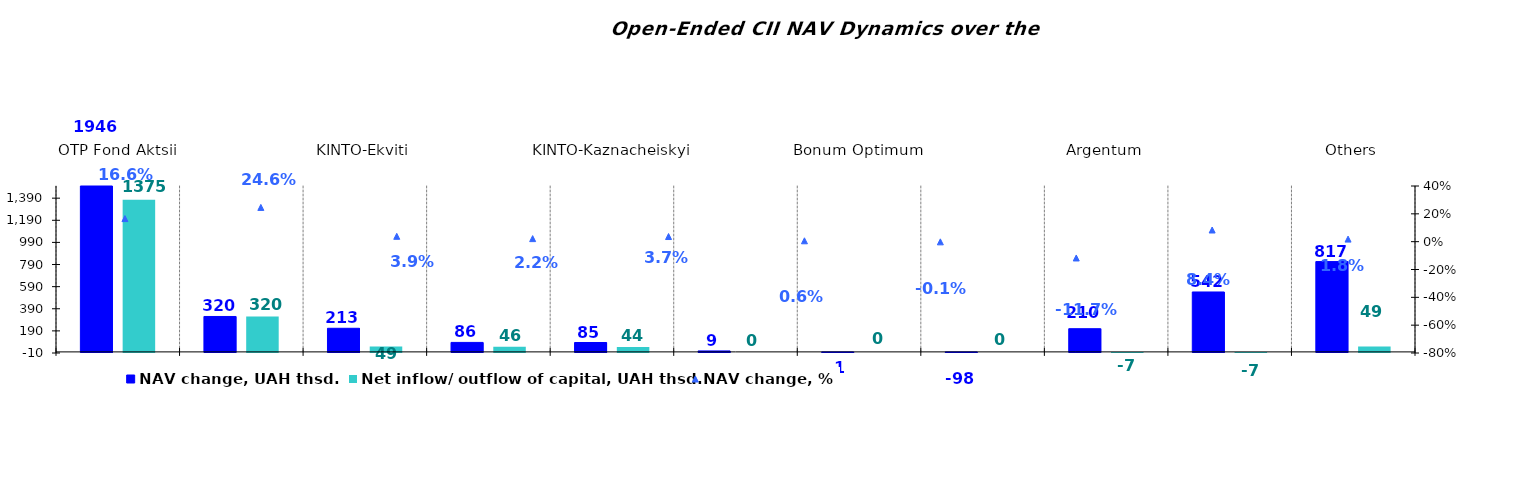
| Category | NAV change, UAH thsd. | Net inflow/ outflow of capital, UAH thsd. |
|---|---|---|
| ОТP Fond Aktsii | 1945.614 | 1374.766 |
| VSI | 320.302 | 320.181 |
| KINTO-Ekviti | 213.468 | 49.396 |
| ОТP - Кlasychnyi | 85.712 | 46.353 |
| KINTO-Kaznacheiskyi | 84.842 | 43.551 |
| UNIVER.UA/Volodymyr Velykyi: Fond Zbalansovanyi | 8.846 | 0 |
| Bonum Optimum | -0.95 | 0 |
| Nadbannia | -97.87 | 0 |
| Аrgentum | 209.795 | -7.311 |
| KINTO- Кlasychnyi | 541.708 | -7.32 |
| Others | 816.626 | 49.483 |